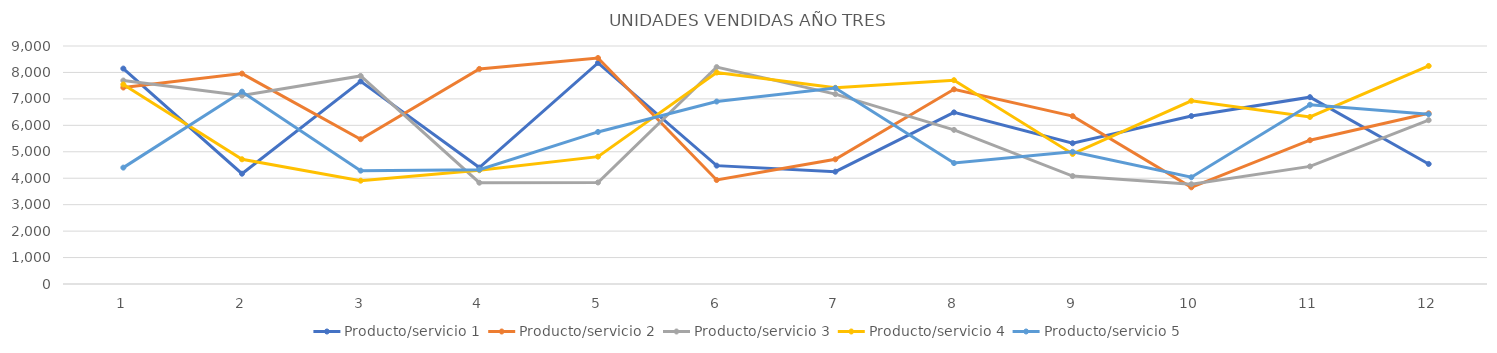
| Category | Producto/servicio 1 | Producto/servicio 2 | Producto/servicio 3 | Producto/servicio 4 | Producto/servicio 5 |
|---|---|---|---|---|---|
| 0 | 8146 | 7430 | 7694 | 7544 | 4401 |
| 1 | 4171 | 7956 | 7127 | 4716 | 7273 |
| 2 | 7662 | 5475 | 7868 | 3907 | 4286 |
| 3 | 4404 | 8133 | 3831 | 4302 | 4322 |
| 4 | 8362 | 8546 | 3840 | 4816 | 5750 |
| 5 | 4476 | 3933 | 8201 | 7998 | 6900 |
| 6 | 4247 | 4715 | 7181 | 7419 | 7411 |
| 7 | 6489 | 7362 | 5828 | 7707 | 4573 |
| 8 | 5323 | 6348 | 4082 | 4919 | 4999 |
| 9 | 6351 | 3656 | 3773 | 6927 | 4036 |
| 10 | 7065 | 5437 | 4447 | 6317 | 6777 |
| 11 | 4540 | 6454 | 6195 | 8245 | 6421 |